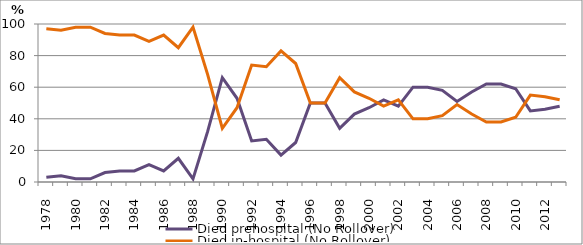
| Category | Died prehospital (No Rollover) | Died in-hospital (No Rollover) |
|---|---|---|
| 1978.0 | 3 | 97 |
| 1979.0 | 4 | 96 |
| 1980.0 | 2 | 98 |
| 1981.0 | 2 | 98 |
| 1982.0 | 6 | 94 |
| 1983.0 | 7 | 93 |
| 1984.0 | 7 | 93 |
| 1985.0 | 11 | 89 |
| 1986.0 | 7 | 93 |
| 1987.0 | 15 | 85 |
| 1988.0 | 2 | 98 |
| 1989.0 | 32 | 68 |
| 1990.0 | 66 | 34 |
| 1991.0 | 53 | 47 |
| 1992.0 | 26 | 74 |
| 1993.0 | 27 | 73 |
| 1994.0 | 17 | 83 |
| 1995.0 | 25 | 75 |
| 1996.0 | 50 | 50 |
| 1997.0 | 50 | 50 |
| 1998.0 | 34 | 66 |
| 1999.0 | 43 | 57 |
| 2000.0 | 47 | 53 |
| 2001.0 | 52 | 48 |
| 2002.0 | 48 | 52 |
| 2003.0 | 60 | 40 |
| 2004.0 | 60 | 40 |
| 2005.0 | 58 | 42 |
| 2006.0 | 51 | 49 |
| 2007.0 | 57 | 43 |
| 2008.0 | 62 | 38 |
| 2009.0 | 62 | 38 |
| 2010.0 | 59 | 41 |
| 2011.0 | 45 | 55 |
| 2012.0 | 46 | 54 |
| 2013.0 | 48 | 52 |